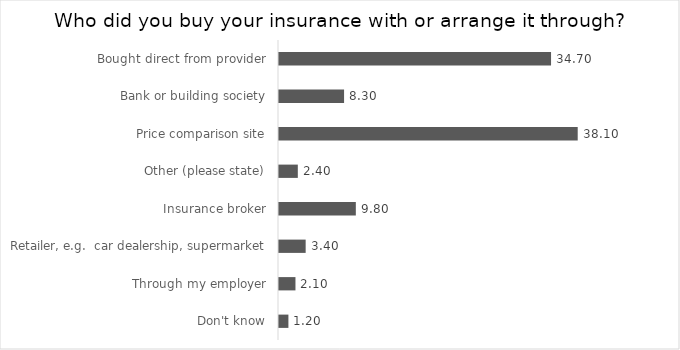
| Category | % of Respondents |
|---|---|
| Bought direct from provider | 34.7 |
| Bank or building society | 8.3 |
| Price comparison site | 38.1 |
| Other (please state) | 2.4 |
| Insurance broker | 9.8 |
| Retailer, e.g.  car dealership, supermarket | 3.4 |
| Through my employer | 2.1 |
| Don't know | 1.2 |